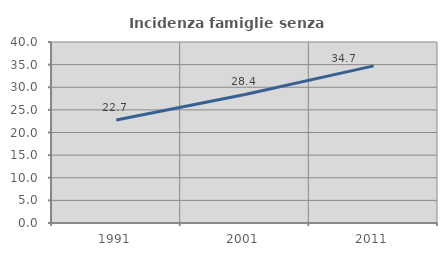
| Category | Incidenza famiglie senza nuclei |
|---|---|
| 1991.0 | 22.747 |
| 2001.0 | 28.402 |
| 2011.0 | 34.722 |